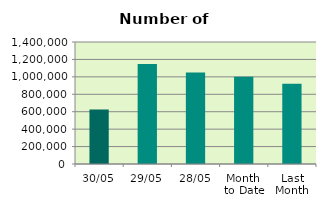
| Category | Series 0 |
|---|---|
| 30/05 | 625880 |
| 29/05 | 1146978 |
| 28/05 | 1050408 |
| Month 
to Date | 1002614.571 |
| Last
Month | 921109.3 |